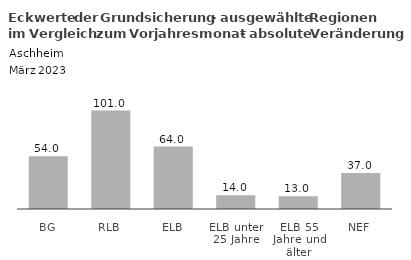
| Category | Series 0 |
|---|---|
| BG | 54 |
| RLB | 101 |
| ELB | 64 |
| ELB unter 25 Jahre | 14 |
| ELB 55 Jahre und älter | 13 |
| NEF | 37 |